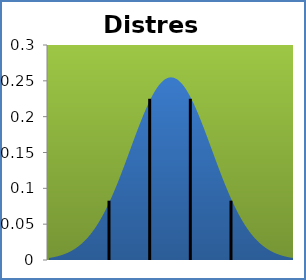
| Category | Series 1 |
|---|---|
| -2.0849999999999995 | 0.003 |
| -2.00675 | 0.003 |
| -1.9285 | 0.004 |
| -1.8502500000000004 | 0.004 |
| -1.7719999999999998 | 0.005 |
| -1.69375 | 0.006 |
| -1.6154999999999995 | 0.007 |
| -1.5372499999999998 | 0.008 |
| -1.459 | 0.009 |
| -1.38075 | 0.01 |
| -1.3025000000000002 | 0.011 |
| -1.22425 | 0.013 |
| -1.1460000000000004 | 0.014 |
| -1.0677499999999998 | 0.016 |
| -0.9895 | 0.018 |
| -0.9112499999999999 | 0.02 |
| -0.8330000000000002 | 0.023 |
| -0.75475 | 0.025 |
| -0.6765000000000003 | 0.028 |
| -0.5982499999999997 | 0.031 |
| -0.52 | 0.034 |
| -0.44174999999999986 | 0.038 |
| -0.36350000000000016 | 0.042 |
| -0.28525 | 0.046 |
| -0.20699999999999985 | 0.05 |
| -0.12875000000000014 | 0.055 |
| -0.05049999999999999 | 0.06 |
| 0.027750000000000163 | 0.065 |
| 0.10599999999999987 | 0.071 |
| 0.18425000000000002 | 0.077 |
| 0.2625000000000002 | 0.083 |
| 0.3407499999999999 | 0.089 |
| 0.41900000000000004 | 0.096 |
| 0.4972500000000002 | 0.102 |
| 0.5754999999999999 | 0.11 |
| 0.6537499999999998 | 0.117 |
| 0.7319999999999998 | 0.124 |
| 0.8102499999999999 | 0.132 |
| 0.8884999999999998 | 0.139 |
| 0.9667499999999998 | 0.147 |
| 1.045 | 0.155 |
| 1.1232499999999999 | 0.162 |
| 1.2015 | 0.17 |
| 1.27975 | 0.178 |
| 1.3579999999999999 | 0.185 |
| 1.43625 | 0.192 |
| 1.5145 | 0.2 |
| 1.5927499999999999 | 0.206 |
| 1.6709999999999998 | 0.213 |
| 1.74925 | 0.219 |
| 1.8275 | 0.225 |
| 1.9057499999999998 | 0.23 |
| 1.984 | 0.235 |
| 2.0622499999999997 | 0.24 |
| 2.1405 | 0.244 |
| 2.21875 | 0.247 |
| 2.2969999999999997 | 0.25 |
| 2.37525 | 0.252 |
| 2.4535 | 0.254 |
| 2.5317499999999997 | 0.255 |
| 2.61 | 0.255 |
| 2.68825 | 0.255 |
| 2.7664999999999997 | 0.254 |
| 2.84475 | 0.252 |
| 2.923 | 0.25 |
| 3.0012499999999998 | 0.247 |
| 3.0795 | 0.244 |
| 3.15775 | 0.24 |
| 3.2359999999999998 | 0.235 |
| 3.31425 | 0.23 |
| 3.3925 | 0.225 |
| 3.47075 | 0.219 |
| 3.549 | 0.213 |
| 3.62725 | 0.206 |
| 3.7055 | 0.2 |
| 3.7837499999999995 | 0.192 |
| 3.862 | 0.185 |
| 3.94025 | 0.178 |
| 4.0184999999999995 | 0.17 |
| 4.09675 | 0.162 |
| 4.175 | 0.155 |
| 4.2532499999999995 | 0.147 |
| 4.3315 | 0.139 |
| 4.40975 | 0.132 |
| 4.4879999999999995 | 0.124 |
| 4.56625 | 0.117 |
| 4.6445 | 0.11 |
| 4.72275 | 0.102 |
| 4.801 | 0.096 |
| 4.87925 | 0.089 |
| 4.9575 | 0.083 |
| 5.03575 | 0.077 |
| 5.114 | 0.071 |
| 5.19225 | 0.065 |
| 5.2705 | 0.06 |
| 5.34875 | 0.055 |
| 5.427 | 0.05 |
| 5.50525 | 0.046 |
| 5.5835 | 0.042 |
| 5.66175 | 0.038 |
| 5.74 | 0.034 |
| 5.818249999999999 | 0.031 |
| 5.8965 | 0.028 |
| 5.97475 | 0.025 |
| 6.053 | 0.023 |
| 6.13125 | 0.02 |
| 6.2095 | 0.018 |
| 6.287749999999999 | 0.016 |
| 6.366 | 0.014 |
| 6.44425 | 0.013 |
| 6.5225 | 0.011 |
| 6.60075 | 0.01 |
| 6.679 | 0.009 |
| 6.757249999999999 | 0.008 |
| 6.8355 | 0.007 |
| 6.91375 | 0.006 |
| 6.991999999999999 | 0.005 |
| 7.07025 | 0.004 |
| 7.1485 | 0.004 |
| 7.226749999999999 | 0.003 |
| 7.305 | 0.003 |